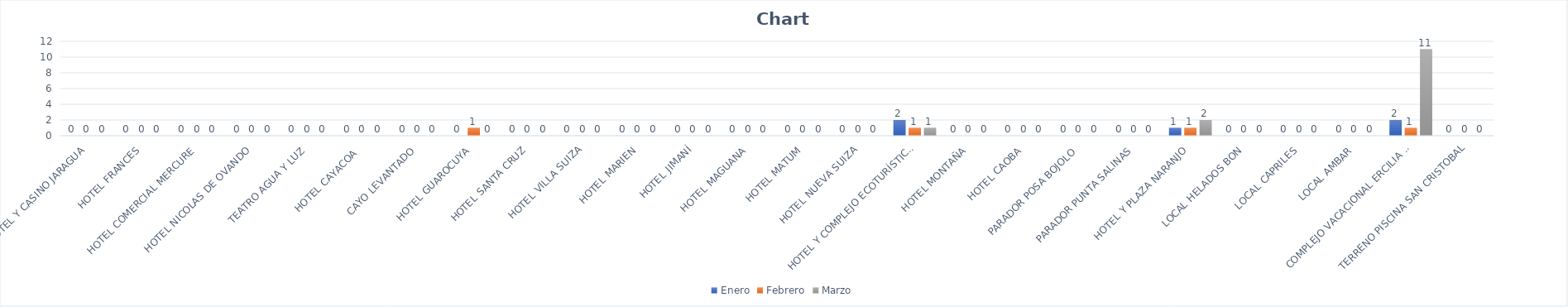
| Category | Enero | Febrero | Marzo |
|---|---|---|---|
| HOTEL Y CASINO JARAGUA | 0 | 0 | 0 |
| HOTEL FRANCES | 0 | 0 | 0 |
| HOTEL COMERCIAL MERCURE | 0 | 0 | 0 |
| HOTEL NICOLAS DE OVANDO | 0 | 0 | 0 |
| TEATRO AGUA Y LUZ | 0 | 0 | 0 |
| HOTEL CAYACOA  | 0 | 0 | 0 |
| CAYO LEVANTADO | 0 | 0 | 0 |
| HOTEL GUAROCUYA | 0 | 1 | 0 |
| HOTEL SANTA CRUZ | 0 | 0 | 0 |
| HOTEL VILLA SUIZA | 0 | 0 | 0 |
| HOTEL MARIEN | 0 | 0 | 0 |
| HOTEL JIMANÍ | 0 | 0 | 0 |
| HOTEL MAGUANA | 0 | 0 | 0 |
| HOTEL MATUM | 0 | 0 | 0 |
| HOTEL NUEVA SUIZA | 0 | 0 | 0 |
| HOTEL Y COMPLEJO ECOTURÍSTICO LA MANSIÓN | 2 | 1 | 1 |
| HOTEL MONTAÑA | 0 | 0 | 0 |
| HOTEL CAOBA | 0 | 0 | 0 |
| PARADOR POSA BOJOLO | 0 | 0 | 0 |
| PARADOR PUNTA SALINAS | 0 | 0 | 0 |
| HOTEL Y PLAZA NARANJO | 1 | 1 | 2 |
| LOCAL HELADOS BON | 0 | 0 | 0 |
| LOCAL CAPRILES | 0 | 0 | 0 |
| LOCAL AMBAR | 0 | 0 | 0 |
| COMPLEJO VACACIONAL ERCILIA PEPÍN | 2 | 1 | 11 |
| TERRENO PISCINA SAN CRISTOBAL | 0 | 0 | 0 |